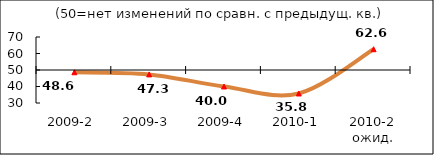
| Category | Диф.индекс ↓ |
|---|---|
| 2009-2 | 48.62 |
| 2009-3 | 47.335 |
| 2009-4 | 40.005 |
| 2010-1 | 35.765 |
| 2010-2 ожид. | 62.59 |